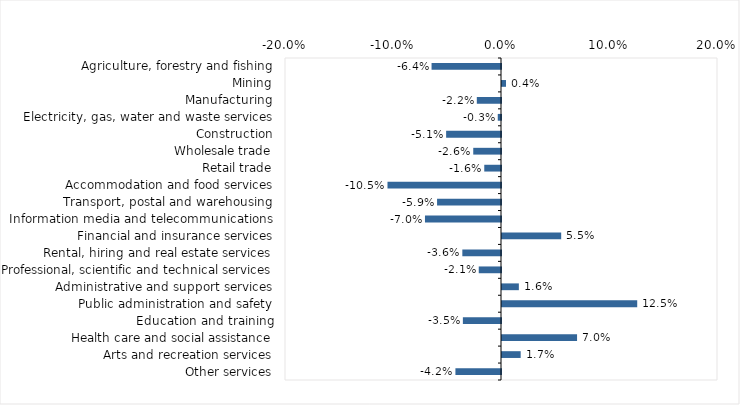
| Category | This week |
|---|---|
| Agriculture, forestry and fishing | -0.064 |
| Mining | 0.004 |
| Manufacturing | -0.022 |
| Electricity, gas, water and waste services | -0.003 |
| Construction | -0.051 |
| Wholesale trade | -0.026 |
| Retail trade | -0.016 |
| Accommodation and food services | -0.105 |
| Transport, postal and warehousing | -0.059 |
| Information media and telecommunications | -0.07 |
| Financial and insurance services | 0.055 |
| Rental, hiring and real estate services | -0.036 |
| Professional, scientific and technical services | -0.021 |
| Administrative and support services | 0.016 |
| Public administration and safety | 0.125 |
| Education and training | -0.035 |
| Health care and social assistance | 0.07 |
| Arts and recreation services | 0.017 |
| Other services | -0.042 |